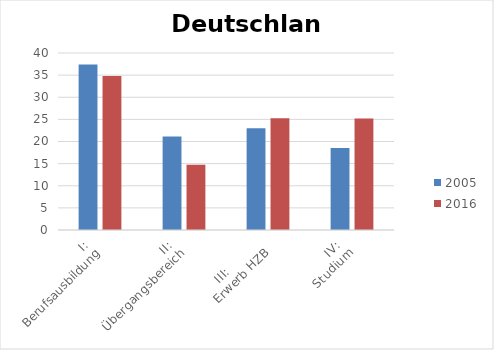
| Category | 2005 | 2016 |
|---|---|---|
| I: 
Berufsausbildung | 37.379 | 34.802 |
| II: 
Übergangsbereich | 21.12 | 14.746 |
| III:           
Erwerb HZB | 22.98 | 25.231 |
| IV: 
Studium | 18.521 | 25.221 |